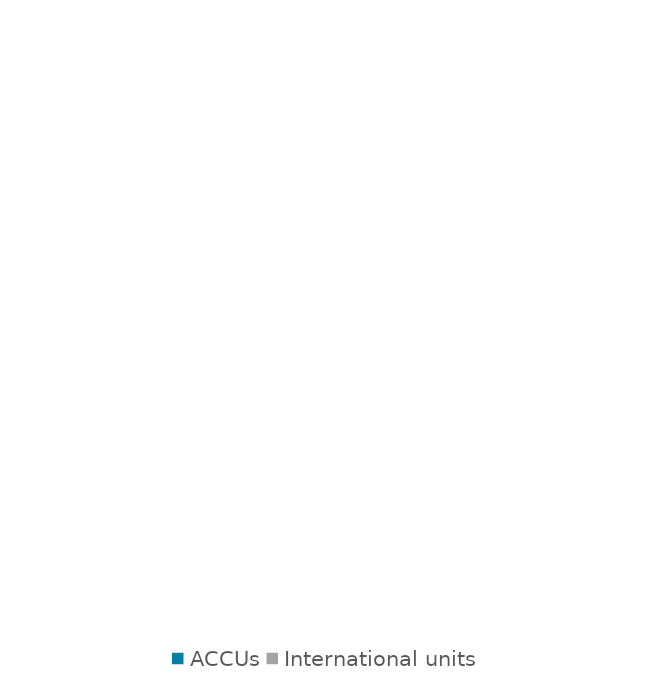
| Category | Surrendered Units |
|---|---|
| 0 | 0 |
| 1 | 0 |